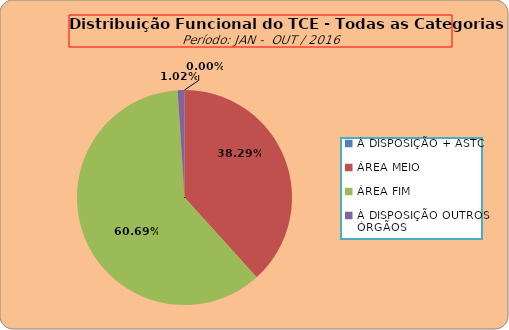
| Category | Series 0 |
|---|---|
| À DISPOSIÇÃO + ASTC | 0 |
| ÁREA MEIO | 188 |
| ÁREA FIM | 298 |
| À DISPOSIÇÃO OUTROS ÓRGÃOS | 5 |